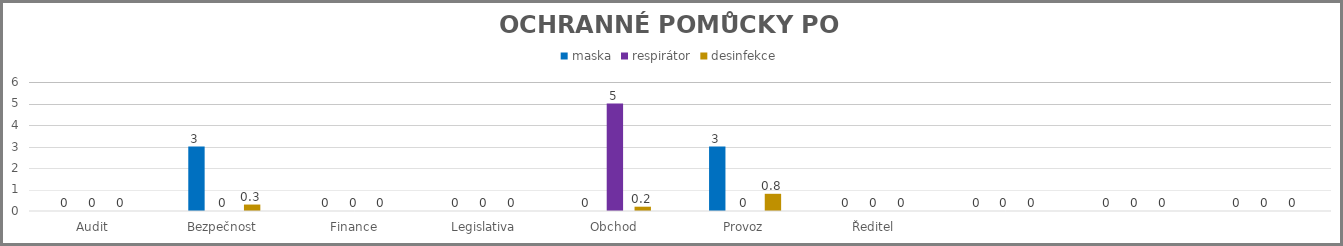
| Category | maska | respirátor | desinfekce |
|---|---|---|---|
| Audit | 0 | 0 | 0 |
| Bezpečnost | 3 | 0 | 0.3 |
| Finance | 0 | 0 | 0 |
| Legislativa | 0 | 0 | 0 |
| Obchod | 0 | 5 | 0.2 |
| Provoz | 3 | 0 | 0.8 |
| Ředitel | 0 | 0 | 0 |